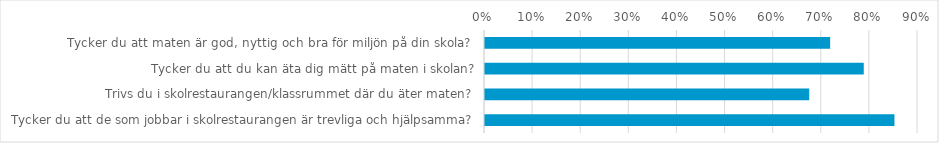
| Category | (Alla) |
|---|---|
| Tycker du att maten är god, nyttig och bra för miljön på din skola?  | 0.717 |
| Tycker du att du kan äta dig mätt på maten i skolan? | 0.787 |
| Trivs du i skolrestaurangen/klassrummet där du äter maten? | 0.674 |
| Tycker du att de som jobbar i skolrestaurangen är trevliga och hjälpsamma? | 0.851 |